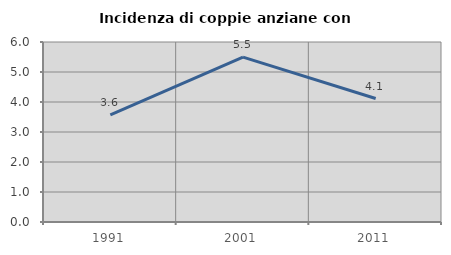
| Category | Incidenza di coppie anziane con figli |
|---|---|
| 1991.0 | 3.571 |
| 2001.0 | 5.495 |
| 2011.0 | 4.116 |